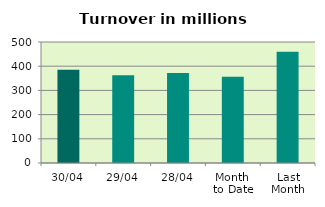
| Category | Series 0 |
|---|---|
| 30/04 | 385.33 |
| 29/04 | 362.255 |
| 28/04 | 371.725 |
| Month 
to Date | 356.105 |
| Last
Month | 459.546 |